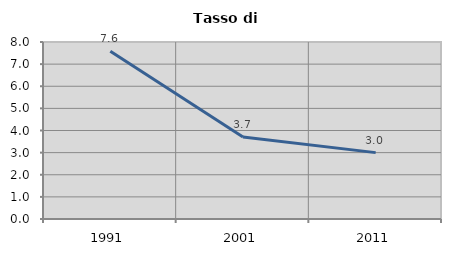
| Category | Tasso di disoccupazione   |
|---|---|
| 1991.0 | 7.586 |
| 2001.0 | 3.704 |
| 2011.0 | 3 |